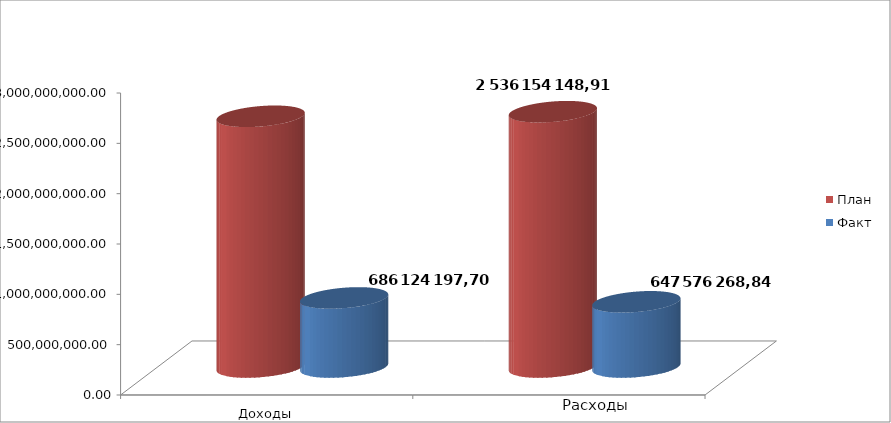
| Category | План | Факт |
|---|---|---|
| 0 | 2490737130.96 | 686124197.7 |
| 1 | 2536154148.91 | 647576268.84 |